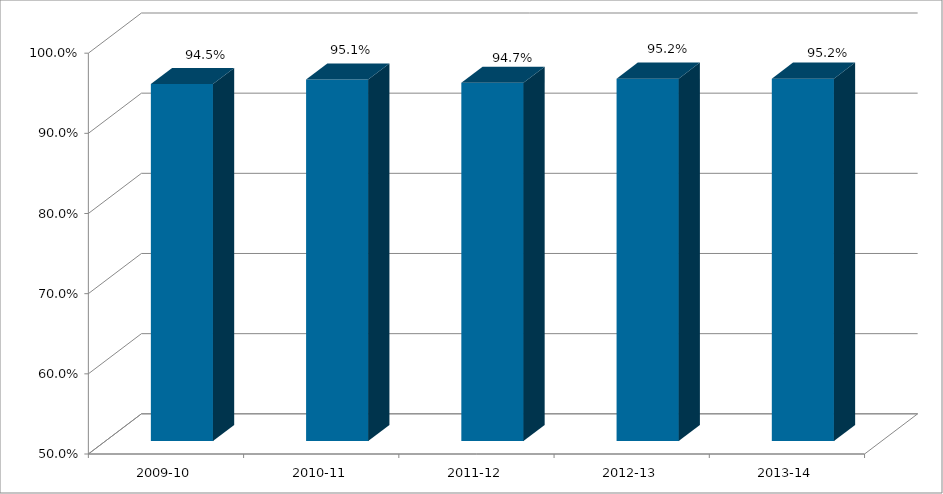
| Category | Series 0 |
|---|---|
| 2009-10 | 0.945 |
| 2010-11 | 0.951 |
| 2011-12 | 0.947 |
| 2012-13 | 0.952 |
| 2013-14 | 0.952 |